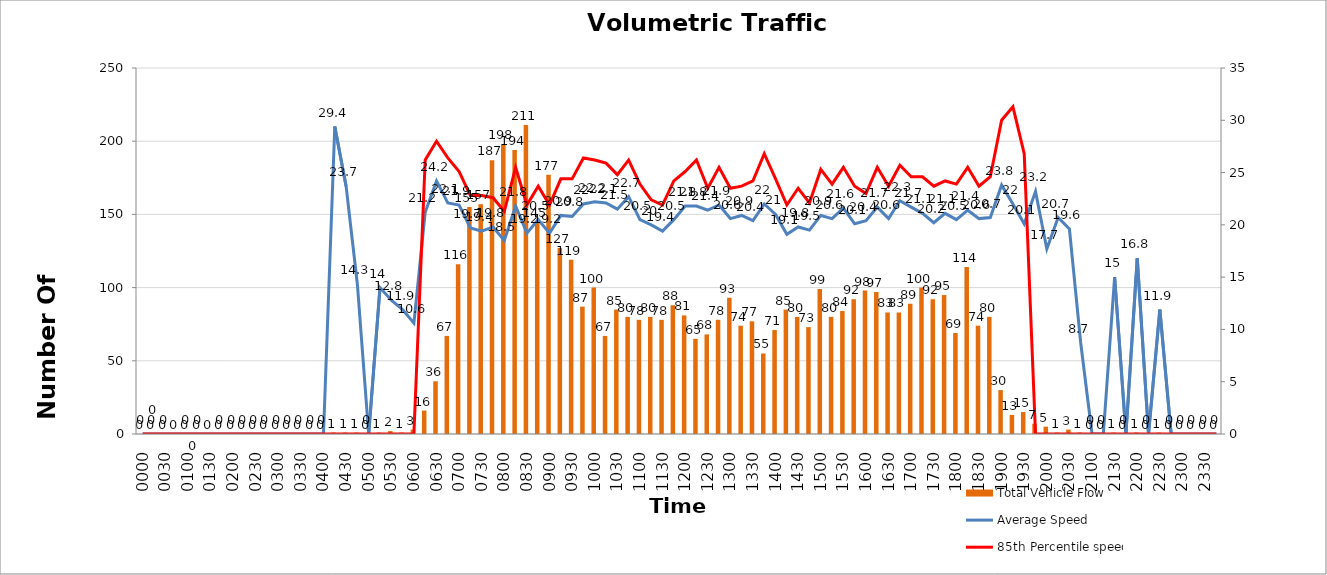
| Category | Total Vehicle Flow |
|---|---|
| 0000 | 0 |
| 0015 | 0 |
| 0030 | 0 |
| 0045 | 0 |
| 0100 | 0 |
| 0115 | 0 |
| 0130 | 0 |
| 0145 | 0 |
| 0200 | 0 |
| 0215 | 0 |
| 0230 | 0 |
| 0245 | 0 |
| 0300 | 0 |
| 0315 | 0 |
| 0330 | 0 |
| 0345 | 0 |
| 0400 | 0 |
| 0415 | 1 |
| 0430 | 1 |
| 0445 | 1 |
| 0500 | 0 |
| 0515 | 1 |
| 0530 | 2 |
| 0545 | 1 |
| 0600 | 3 |
| 0615 | 16 |
| 0630 | 36 |
| 0645 | 67 |
| 0700 | 116 |
| 0715 | 155 |
| 0730 | 157 |
| 0745 | 187 |
| 0800 | 198 |
| 0815 | 194 |
| 0830 | 211 |
| 0845 | 145 |
| 0900 | 177 |
| 0915 | 127 |
| 0930 | 119 |
| 0945 | 87 |
| 1000 | 100 |
| 1015 | 67 |
| 1030 | 85 |
| 1045 | 80 |
| 1100 | 78 |
| 1115 | 80 |
| 1130 | 78 |
| 1145 | 88 |
| 1200 | 81 |
| 1215 | 65 |
| 1230 | 68 |
| 1245 | 78 |
| 1300 | 93 |
| 1315 | 74 |
| 1330 | 77 |
| 1345 | 55 |
| 1400 | 71 |
| 1415 | 85 |
| 1430 | 80 |
| 1445 | 73 |
| 1500 | 99 |
| 1515 | 80 |
| 1530 | 84 |
| 1545 | 92 |
| 1600 | 98 |
| 1615 | 97 |
| 1630 | 83 |
| 1645 | 83 |
| 1700 | 89 |
| 1715 | 100 |
| 1730 | 92 |
| 1745 | 95 |
| 1800 | 69 |
| 1815 | 114 |
| 1830 | 74 |
| 1845 | 80 |
| 1900 | 30 |
| 1915 | 13 |
| 1930 | 15 |
| 1945 | 7 |
| 2000 | 5 |
| 2015 | 1 |
| 2030 | 3 |
| 2045 | 1 |
| 2100 | 0 |
| 2115 | 0 |
| 2130 | 1 |
| 2145 | 0 |
| 2200 | 1 |
| 2215 | 0 |
| 2230 | 1 |
| 2245 | 0 |
| 2300 | 0 |
| 2315 | 0 |
| 2330 | 0 |
| 2345 | 0 |